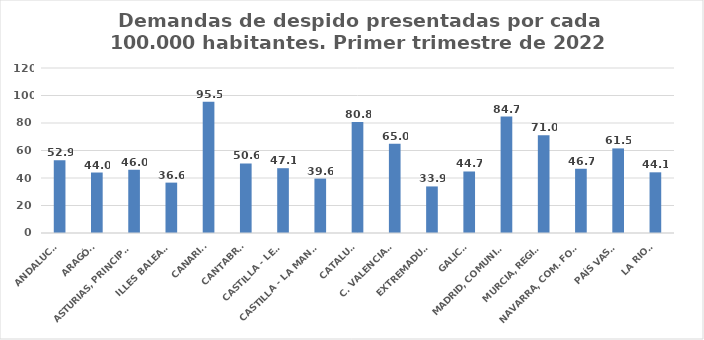
| Category | Series 0 |
|---|---|
| ANDALUCÍA | 52.875 |
| ARAGÓN | 43.989 |
| ASTURIAS, PRINCIPADO | 45.993 |
| ILLES BALEARS | 36.642 |
| CANARIAS | 95.478 |
| CANTABRIA | 50.579 |
| CASTILLA - LEÓN | 47.13 |
| CASTILLA - LA MANCHA | 39.567 |
| CATALUÑA | 80.775 |
| C. VALENCIANA | 64.999 |
| EXTREMADURA | 33.863 |
| GALICIA | 44.735 |
| MADRID, COMUNIDAD | 84.721 |
| MURCIA, REGIÓN | 71.044 |
| NAVARRA, COM. FORAL | 46.714 |
| PAÍS VASCO | 61.526 |
| LA RIOJA | 44.134 |